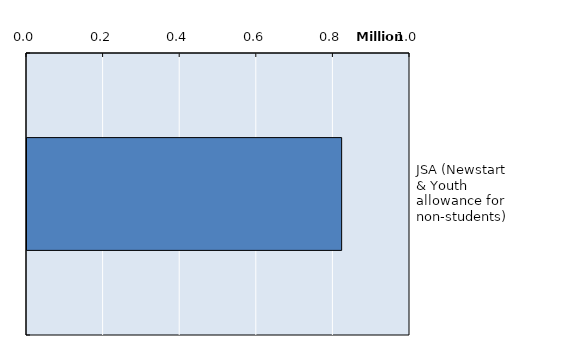
| Category | Series 0 |
|---|---|
| JSA (Newstart & Youth allowance for non-students) | 821542 |